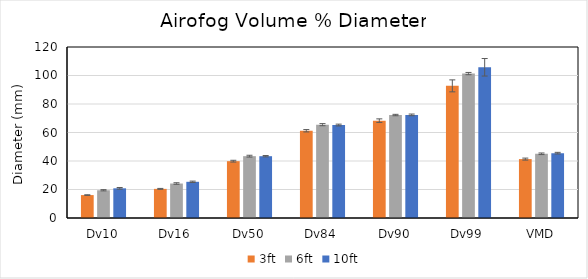
| Category | 3ft | 6ft | 10ft |
|---|---|---|---|
| Dv10 | 16.082 | 19.466 | 20.83 |
| Dv16 | 20.442 | 24.198 | 25.402 |
| Dv50 | 39.882 | 43.398 | 43.37 |
| Dv84 | 61.228 | 65.498 | 65.228 |
| Dv90 | 68.328 | 72.258 | 72.344 |
| Dv99 | 92.728 | 101.348 | 105.772 |
| VMD | 41.338 | 45.06 | 45.5 |